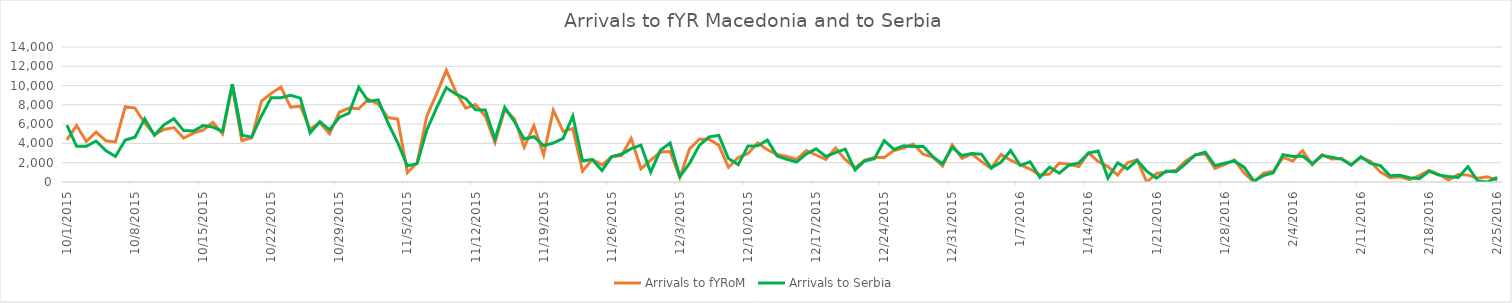
| Category | Arrivals to fYRoM | Arrivals to Serbia |
|---|---|---|
| 10/1/15 | 4370 | 5900 |
| 10/2/15 | 5853 | 3700 |
| 10/3/15 | 4202 | 3700 |
| 10/4/15 | 5181 | 4250 |
| 10/5/15 | 4282 | 3250 |
| 10/6/15 | 4156 | 2650 |
| 10/7/15 | 7816 | 4350 |
| 10/8/15 | 7663 | 4650 |
| 10/9/15 | 6107 | 6550 |
| 10/10/15 | 4922 | 4850 |
| 10/11/15 | 5448 | 5950 |
| 10/12/15 | 5645 | 6556 |
| 10/13/15 | 4551 | 5330 |
| 10/14/15 | 5073 | 5280 |
| 10/15/15 | 5373 | 5850 |
| 10/16/15 | 6181 | 5700 |
| 10/17/15 | 4988 | 5250 |
| 10/18/15 | 10005 | 10150 |
| 10/19/15 | 4299 | 4850 |
| 10/20/15 | 4584 | 4650 |
| 10/21/15 | 8384 | 6850 |
| 10/22/15 | 9174 | 8750 |
| 10/23/15 | 9840 | 8750 |
| 10/24/15 | 7752 | 9000 |
| 10/25/15 | 7864 | 8700 |
| 10/26/15 | 5500 | 5100 |
| 10/27/15 | 6146 | 6257 |
| 10/28/15 | 5000 | 5415 |
| 10/29/15 | 7231 | 6700 |
| 10/30/15 | 7663 | 7138 |
| 10/31/15 | 7590 | 9834 |
| 11/1/15 | 8584 | 8354 |
| 11/2/15 | 8075 | 8521 |
| 11/3/15 | 6682 | 6129 |
| 11/4/15 | 6532 | 4073 |
| 11/5/15 | 960 | 1652 |
| 11/6/15 | 1987 | 1906 |
| 11/7/15 | 6847 | 5397 |
| 11/8/15 | 9148 | 7695 |
| 11/9/15 | 11572 | 9785 |
| 11/10/15 | 9305 | 9107 |
| 11/11/15 | 7651 | 8648 |
| 11/12/15 | 8038 | 7500 |
| 11/13/15 | 6826 | 7464 |
| 11/14/15 | 4107 | 4453 |
| 11/15/15 | 7511 | 7734 |
| 11/16/15 | 6557 | 6267 |
| 11/17/15 | 3621 | 4460 |
| 11/18/15 | 5831 | 4694 |
| 11/19/15 | 2816 | 3765 |
| 11/20/15 | 7453 | 4042 |
| 11/21/15 | 5255 | 4527 |
| 11/22/15 | 5539 | 6826 |
| 11/23/15 | 1113 | 2201 |
| 11/24/15 | 2347 | 2335 |
| 11/25/15 | 1779 | 1194 |
| 11/26/15 | 2617 | 2636 |
| 11/27/15 | 2744 | 2878 |
| 11/28/15 | 4520 | 3454 |
| 11/29/15 | 1373 | 3825 |
| 11/30/15 | 2270 | 1009 |
| 12/1/15 | 3094 | 3284 |
| 12/2/15 | 3174 | 4040 |
| 12/3/15 | 494 | 553 |
| 12/4/15 | 3436 | 1927 |
| 12/5/15 | 4430 | 3799 |
| 12/6/15 | 4425 | 4686 |
| 12/7/15 | 3826 | 4823 |
| 12/8/15 | 1508 | 2437 |
| 12/9/15 | 2550 | 1807 |
| 12/10/15 | 2956 | 3723 |
| 12/11/15 | 4047 | 3747 |
| 12/12/15 | 3338 | 4339 |
| 12/13/15 | 2849 | 2698 |
| 12/14/15 | 2644 | 2353 |
| 12/15/15 | 2349 | 2067 |
| 12/16/15 | 3264 | 2916 |
| 12/17/15 | 2801 | 3438 |
| 12/18/15 | 2332 | 2649 |
| 12/19/15 | 3515 | 3052 |
| 12/20/15 | 2338 | 3405 |
| 12/21/15 | 1470 | 1253 |
| 12/22/15 | 2272 | 2186 |
| 12/23/15 | 2529 | 2415 |
| 12/24/15 | 2529 | 4279 |
| 12/25/15 | 3268 | 3390 |
| 12/26/15 | 3521 | 3757 |
| 12/27/15 | 3938 | 3674 |
| 12/28/15 | 2884 | 3708 |
| 12/29/15 | 2577 | 2629 |
| 12/30/15 | 1665 | 1879 |
| 12/31/15 | 3848 | 3602 |
| 1/1/16 | 2454 | 2745 |
| 1/2/16 | 2918 | 2947 |
| 1/3/16 | 2112 | 2889 |
| 1/4/16 | 1415 | 1462 |
| 1/5/16 | 2842 | 2041 |
| 1/6/16 | 2258 | 3273 |
| 1/7/16 | 1776 | 1715 |
| 1/8/16 | 1344 | 2100 |
| 1/9/16 | 715 | 489 |
| 1/10/16 | 819 | 1538 |
| 1/11/16 | 1959 | 905 |
| 1/12/16 | 1840 | 1743 |
| 1/13/16 | 1600 | 1973 |
| 1/14/16 | 3022 | 3006 |
| 1/15/16 | 2119 | 3213 |
| 1/16/16 | 1598 | 415 |
| 1/17/16 | 720 | 1995 |
| 1/18/16 | 1980 | 1362 |
| 1/19/16 | 2298 | 2244 |
| 1/20/16 | 0 | 1113 |
| 1/21/16 | 892 | 397 |
| 1/22/16 | 1030 | 1134 |
| 1/23/16 | 1208 | 1064 |
| 1/24/16 | 2174 | 1895 |
| 1/25/16 | 2836 | 2827 |
| 1/26/16 | 2908 | 3091 |
| 1/27/16 | 1402 | 1695 |
| 1/28/16 | 1837 | 1940 |
| 1/29/16 | 2292 | 2167 |
| 1/30/16 | 931 | 1540 |
| 1/31/16 | 0 | 103 |
| 2/1/16 | 908 | 660 |
| 2/2/16 | 1121 | 966 |
| 2/3/16 | 2558 | 2825 |
| 2/4/16 | 2173 | 2653 |
| 2/5/16 | 3259 | 2694 |
| 2/6/16 | 1780 | 1901 |
| 2/7/16 | 2838 | 2739 |
| 2/8/16 | 2392 | 2563 |
| 2/9/16 | 2441 | 2379 |
| 2/10/16 | 1817 | 1758 |
| 2/11/16 | 2540 | 2636 |
| 2/12/16 | 2115 | 1923 |
| 2/13/16 | 1019 | 1699 |
| 2/14/16 | 452 | 641 |
| 2/15/16 | 542 | 691 |
| 2/16/16 | 234 | 443 |
| 2/17/16 | 668 | 345 |
| 2/18/16 | 1200 | 1117 |
| 2/19/16 | 799 | 713 |
| 2/20/16 | 209 | 580 |
| 2/21/16 | 774 | 476 |
| 2/22/16 | 714 | 1595 |
| 2/23/16 | 382 | 106 |
| 2/24/16 | 551 | 1 |
| 2/25/16 | 168 | 475 |